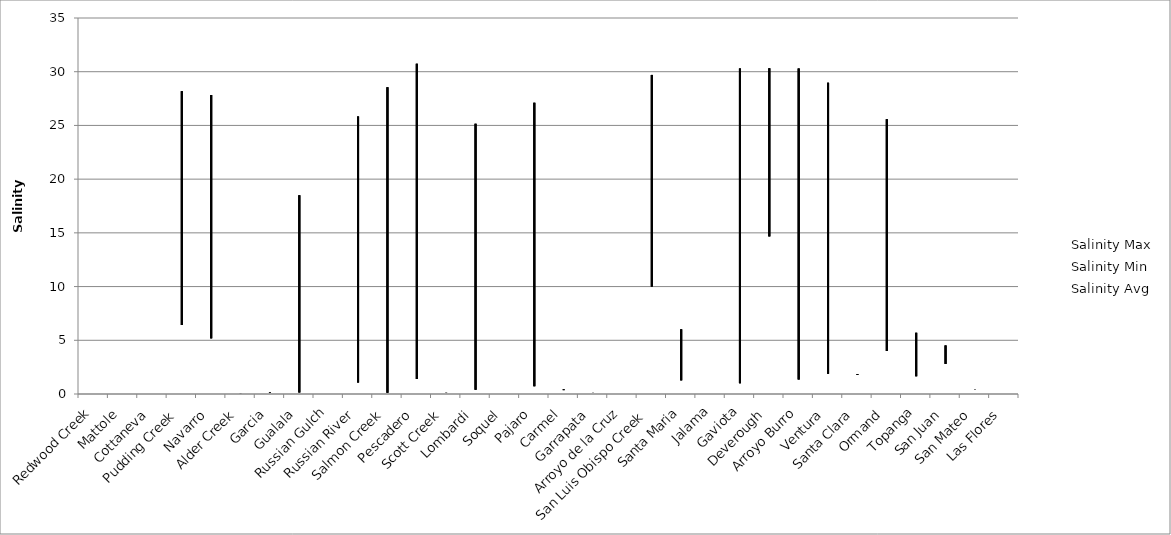
| Category | Salinity Max | Salinity Min | Salinity Avg |
|---|---|---|---|
| Redwood Creek | 0.03 | 0.03 | 0.03 |
| Mattole | 0.07 | 0.07 | 0.07 |
| Cottaneva | 0.07 | 0.07 | 0.07 |
| Pudding Creek | 28.19 | 6.42 | 18.527 |
| Navarro | 27.83 | 5.18 | 19.112 |
| Alder Creek | 0.09 | 0.08 | 0.082 |
| Garcia | 0.14 | 0.09 | 0.11 |
| Gualala | 18.5 | 0.14 | 2.757 |
| Russian Gulch | 0.08 | 0.08 | 0.08 |
| Russian River | 25.84 | 1.07 | 12.438 |
| Salmon Creek | 28.55 | 0.11 | 7.994 |
| Pescadero | 30.73 | 1.4 | 17.875 |
| Scott Creek | 0.11 | 0.09 | 0.1 |
| Lombardi | 25.15 | 0.4 | 12.402 |
| Soquel | 0.25 | 0.25 | 0.25 |
| Pajaro | 27.12 | 0.73 | 11.935 |
| Carmel | 0.43 | 0.36 | 0.401 |
| Garrapata | 0.11 | 0.1 | 0.102 |
| Arroyo de la Cruz | 0.2 | 0.2 | 0.2 |
| San Luis Obispo Creek | 29.7 | 10 | 26.134 |
| Santa Maria | 6.02 | 1.27 | 3.488 |
| Jalama | 0.66 | 0.66 | 0.66 |
| Gaviota | 30.31 | 1 | 17.849 |
| Deverough | 30.32 | 14.67 | 24.806 |
| Arroyo Burro | 30.3 | 1.36 | 19.394 |
| Ventura | 28.98 | 1.89 | 21.922 |
| Santa Clara | 1.85 | 1.77 | 1.799 |
| Ormand | 25.58 | 4 | 13.663 |
| Topanga | 5.7 | 1.65 | 2.099 |
| San Juan | 4.52 | 2.8 | 3.332 |
| San Mateo | 0.45 | 0.43 | 0.44 |
| Las Flores | 1.45 | 1.45 | 1.45 |